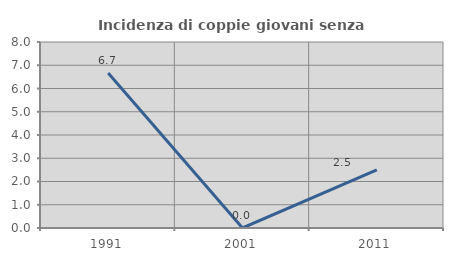
| Category | Incidenza di coppie giovani senza figli |
|---|---|
| 1991.0 | 6.667 |
| 2001.0 | 0 |
| 2011.0 | 2.5 |